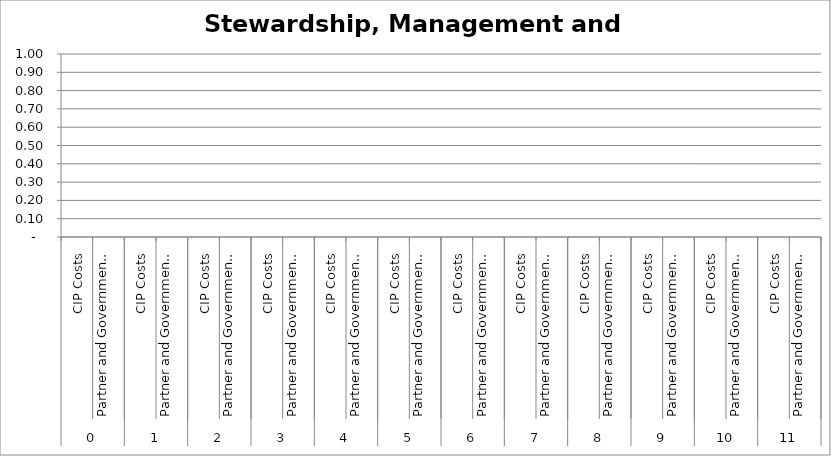
| Category | Stewardship, Management and Accountability |
|---|---|
| 0 | 0 |
| 1 | 0 |
| 2 | 0 |
| 3 | 0 |
| 4 | 0 |
| 5 | 0 |
| 6 | 0 |
| 7 | 0 |
| 8 | 0 |
| 9 | 0 |
| 10 | 0 |
| 11 | 0 |
| 12 | 0 |
| 13 | 0 |
| 14 | 0 |
| 15 | 0 |
| 16 | 0 |
| 17 | 0 |
| 18 | 0 |
| 19 | 0 |
| 20 | 0 |
| 21 | 0 |
| 22 | 0 |
| 23 | 0 |